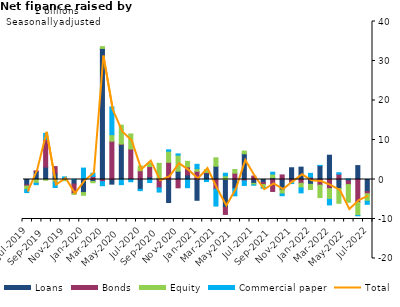
| Category | Loans | Bonds | Equity | Commercial paper |
|---|---|---|---|---|
| Jul-2019 | -1.367 | -0.281 | -0.928 | -0.742 |
| Aug-2019 | 2.007 | 0.174 | -0.952 | -0.357 |
| Sep-2019 | 3.143 | 6.981 | -0.191 | 1.548 |
| Oct-2019 | 1.611 | 1.651 | -0.61 | -1.416 |
| Nov-2019 | 0.007 | -0.195 | -0.104 | 0.654 |
| Dec-2019 | -1.151 | -2.415 | -0.194 | 0.031 |
| Jan-2020 | -3.306 | 0.155 | -0.691 | 2.731 |
| Feb-2020 | -0.493 | 0.764 | -0.33 | 0.826 |
| Mar-2020 | 33.178 | -0.54 | 0.463 | -1.041 |
| Apr-2020 | -1.177 | 9.698 | 1.656 | 7.014 |
| May-2020 | 8.843 | 0.131 | 4.777 | -1.303 |
| Jun-2020 | 0.233 | 7.494 | 3.805 | -0.564 |
| Jul-2020 | -2.481 | 2.212 | 1.208 | -0.34 |
| Aug-2020 | 0.667 | 2.614 | 0.769 | -0.762 |
| Sep-2020 | 0.239 | -2.122 | 3.865 | -1.058 |
| Oct-2020 | -5.829 | 4.349 | 2.798 | 0.366 |
| Nov-2020 | 2.095 | -2.106 | 4.064 | 0.327 |
| Dec-2020 | 1.17 | 2.015 | 1.409 | -2.076 |
| Jan-2021 | -5.265 | 2.081 | 0.654 | 1.11 |
| Feb-2021 | 1.607 | 0.193 | 0.727 | -0.517 |
| Mar-2021 | 3.355 | -2.452 | 2.132 | -4.272 |
| Apr-2021 | -7.091 | -1.754 | 0.939 | 0.65 |
| May-2021 | -2.31 | 1.596 | 0.927 | -1.817 |
| Jun-2021 | 6.509 | -0.338 | 0.682 | -1.166 |
| Jul-2021 | -0.99 | 0.867 | -0.367 | -0.072 |
| Aug-2021 | -0.773 | -0.499 | -0.797 | -0.136 |
| Sep-2021 | 0.471 | -3.026 | 0.896 | 0.481 |
| Oct-2021 | -2.641 | 1.158 | -1.021 | -0.446 |
| Nov-2021 | 2.974 | -0.729 | -0.2 | -0.107 |
| Dec-2021 | 3.129 | -0.957 | -1.18 | -1.25 |
| Jan-2022 | -1.218 | 0.598 | -1.317 | 0.961 |
| Feb-2022 | 3.522 | -1.431 | -3.144 | 0.058 |
| Mar-2022 | 6.147 | -2.323 | -2.71 | -1.403 |
| Apr-2022 | -2.282 | 1.362 | -3.733 | 0.359 |
| May-2022 | -0.347 | -0.942 | -4.479 | 0.142 |
| Jun-2022 | 3.518 | -5.816 | -3.297 | -0.081 |
| Jul-2022 | -3.053 | -0.555 | -1.894 | -0.789 |